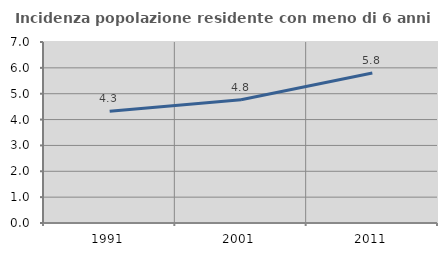
| Category | Incidenza popolazione residente con meno di 6 anni |
|---|---|
| 1991.0 | 4.322 |
| 2001.0 | 4.764 |
| 2011.0 | 5.798 |